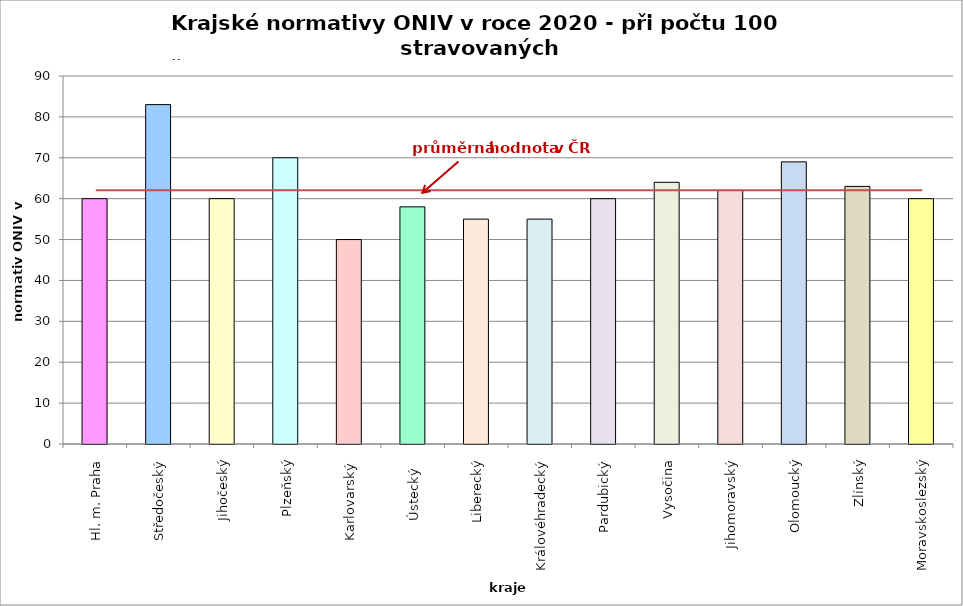
| Category | Series 0 |
|---|---|
| Hl. m. Praha | 60 |
| Středočeský | 83 |
| Jihočeský | 60 |
| Plzeňský | 70 |
| Karlovarský  | 50 |
| Ústecký   | 58 |
| Liberecký | 55 |
| Královéhradecký | 55 |
| Pardubický | 60 |
| Vysočina | 64 |
| Jihomoravský | 62 |
| Olomoucký | 69 |
| Zlínský | 63 |
| Moravskoslezský | 60 |